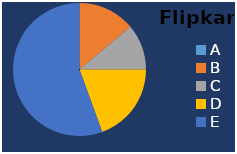
| Category | Flipkart |
|---|---|
| A | 0 |
| B | 50 |
| C | 40 |
| D | 70 |
| E | 200 |